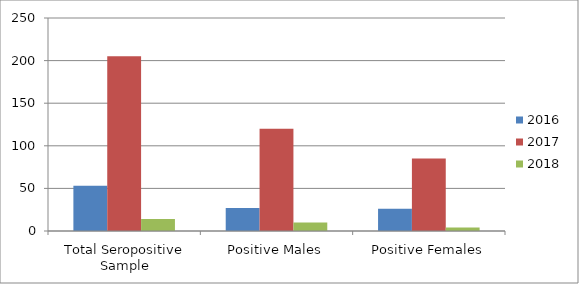
| Category | 2016 | 2017 | 2018 |
|---|---|---|---|
| Total Seropositive Sample | 53 | 205 | 14 |
| Positive Males | 27 | 120 | 10 |
| Positive Females | 26 | 85 | 4 |